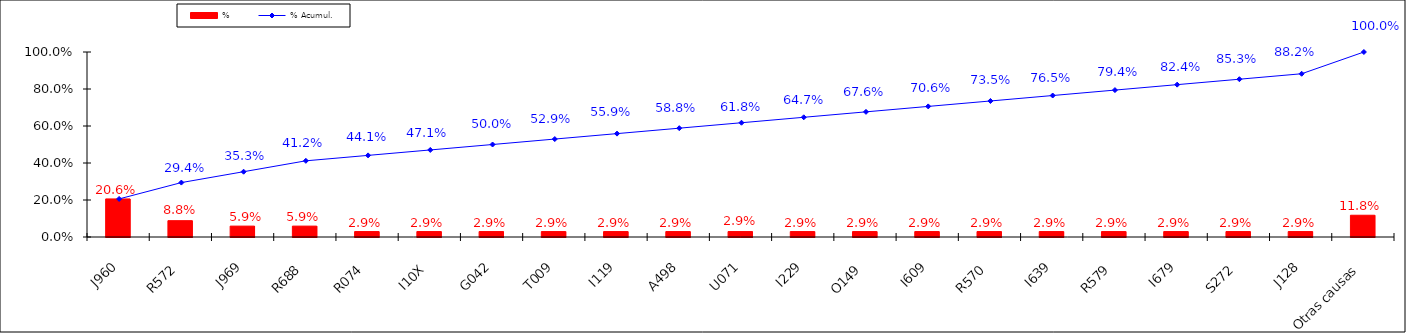
| Category | % |
|---|---|
| J960 | 0.206 |
| R572 | 0.088 |
| J969 | 0.059 |
| R688 | 0.059 |
| R074 | 0.029 |
| I10X | 0.029 |
| G042 | 0.029 |
| T009 | 0.029 |
| I119 | 0.029 |
| A498 | 0.029 |
| U071 | 0.029 |
| I229 | 0.029 |
| O149 | 0.029 |
| I609 | 0.029 |
| R570 | 0.029 |
| I639 | 0.029 |
| R579 | 0.029 |
| I679 | 0.029 |
| S272 | 0.029 |
| J128 | 0.029 |
| Otras causas | 0.118 |